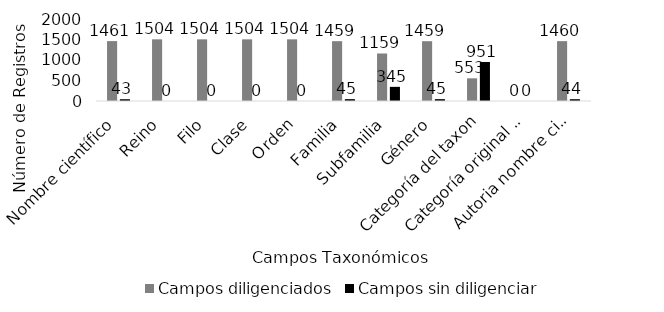
| Category | Campos diligenciados | Campos sin diligenciar |
|---|---|---|
| Nombre científico | 1461 | 43 |
| Reino | 1504 | 0 |
| Filo | 1504 | 0 |
| Clase | 1504 | 0 |
| Orden | 1504 | 0 |
| Familia | 1459 | 45 |
| Subfamilia | 1159 | 345 |
| Género | 1459 | 45 |
| Categoría del taxon | 553 | 951 |
| Categoría original del taxon | 0 | 0 |
| Autoria nombre científico | 1460 | 44 |